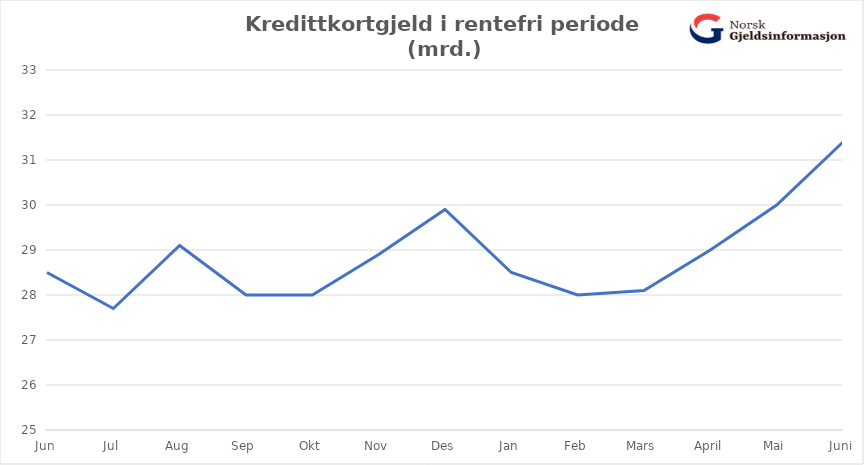
| Category | Ikke-rentebærende rammekreditt | Rentebærende rammekreditt |
|---|---|---|
| Jun | 28.5 |  |
| Jul | 27.7 |  |
| Aug | 29.1 |  |
| Sep | 28 |  |
| Okt | 28 |  |
| Nov | 28.9 |  |
| Des | 29.9 |  |
| Jan | 28.5 |  |
| Feb | 28 |  |
| Mars | 28.1 |  |
| April | 29 |  |
| Mai | 30 |  |
| Juni | 31.4 |  |